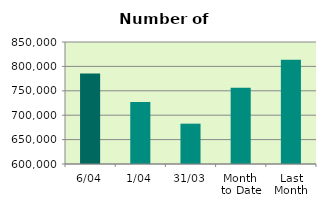
| Category | Series 0 |
|---|---|
| 6/04 | 785290 |
| 1/04 | 727062 |
| 31/03 | 682634 |
| Month 
to Date | 756176 |
| Last
Month | 813408 |